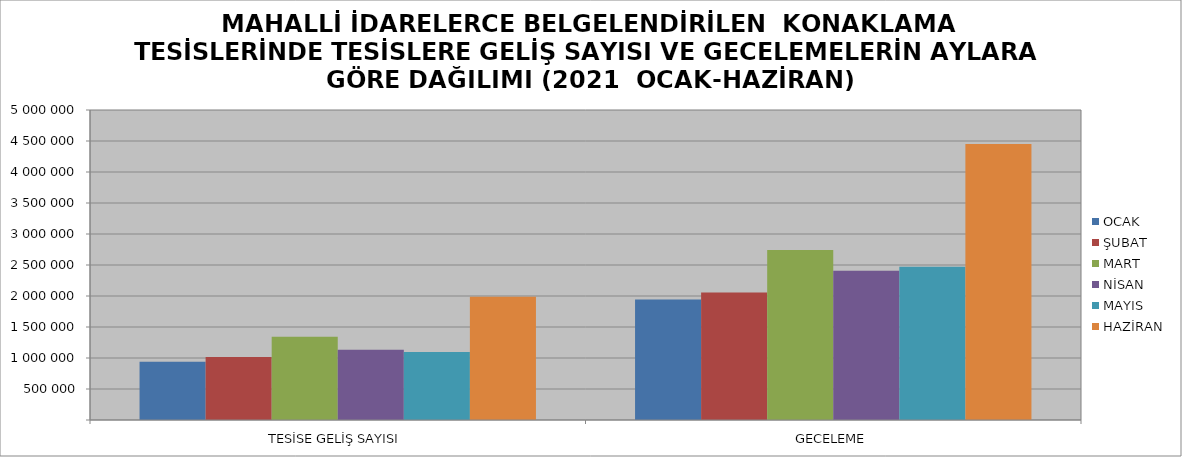
| Category | OCAK | ŞUBAT | MART | NİSAN | MAYIS | HAZİRAN |
|---|---|---|---|---|---|---|
| TESİSE GELİŞ SAYISI | 940331 | 1017199 | 1342202 | 1131069 | 1098456 | 1989433 |
| GECELEME | 1943007 | 2056594 | 2743257 | 2406723 | 2471826 | 4450821 |